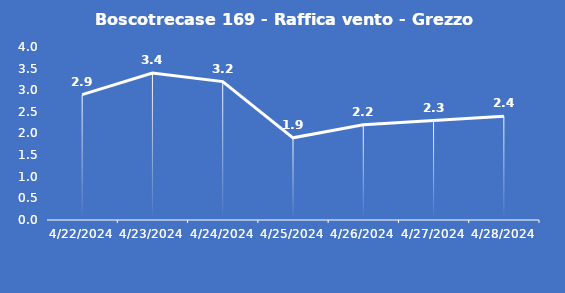
| Category | Boscotrecase 169 - Raffica vento - Grezzo (m/s) |
|---|---|
| 4/22/24 | 2.9 |
| 4/23/24 | 3.4 |
| 4/24/24 | 3.2 |
| 4/25/24 | 1.9 |
| 4/26/24 | 2.2 |
| 4/27/24 | 2.3 |
| 4/28/24 | 2.4 |